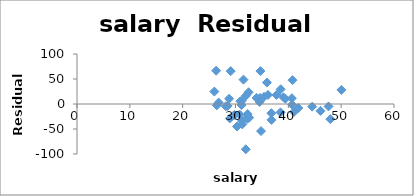
| Category | Series 0 |
|---|---|
| 31.144 | -2.068 |
| 47.951 | -30.212 |
| 32.175 | -27.625 |
| 28.934 | -28.86 |
| 41.078 | -15.848 |
| 34.571 | 4.03 |
| 50.045 | 28.164 |
| 39.076 | 13.32 |
| 32.588 | -27.227 |
| 32.291 | -20.17 |
| 38.518 | -16.755 |
| 29.783 | -21.751 |
| 39.431 | 10.519 |
| 36.785 | -18.337 |
| 31.511 | 48.733 |
| 34.652 | 12.179 |
| 32.257 | -29.526 |
| 26.461 | -2.531 |
| 31.972 | 16.495 |
| 40.661 | 11.596 |
| 40.795 | 47.688 |
| 41.895 | -8.007 |
| 35.948 | 42.937 |
| 26.818 | 2.937 |
| 31.189 | 6.237 |
| 28.785 | 10.549 |
| 30.922 | 5.587 |
| 34.836 | -54.149 |
| 34.72 | 65.865 |
| 46.087 | -13.748 |
| 28.493 | -3.82 |
| 47.612 | -4.88 |
| 30.793 | -21.083 |
| 26.327 | 66.571 |
| 36.802 | -31.783 |
| 28.172 | -4.42 |
| 38.555 | 29.408 |
| 44.51 | -5.312 |
| 40.729 | -1.424 |
| 30.279 | -45.076 |
| 25.994 | 24.855 |
| 32.477 | 23.516 |
| 31.223 | -34.005 |
| 29.082 | 65.766 |
| 35.406 | 14.433 |
| 33.987 | 12.293 |
| 36.151 | 18.085 |
| 31.944 | -90.531 |
| 37.746 | 18.043 |
| 31.285 | -40.657 |